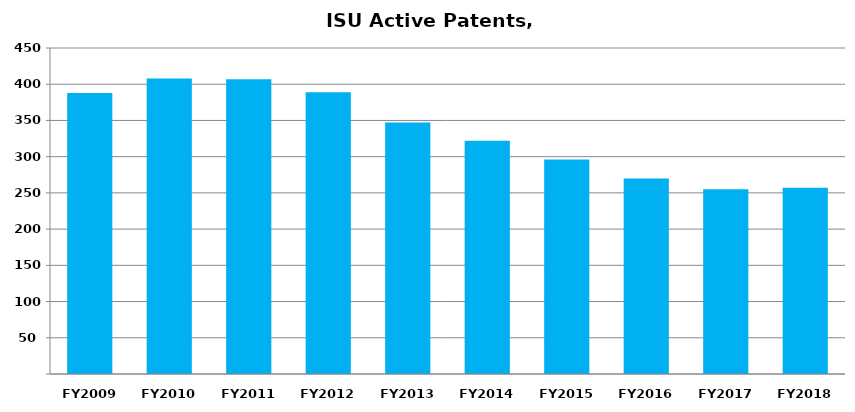
| Category | Active Patents |
|---|---|
| FY2009 | 388 |
| FY2010 | 408 |
| FY2011 | 407 |
| FY2012 | 389 |
| FY2013 | 347 |
| FY2014 | 322 |
| FY2015 | 296 |
| FY2016 | 270 |
| FY2017 | 255 |
| FY2018 | 257 |